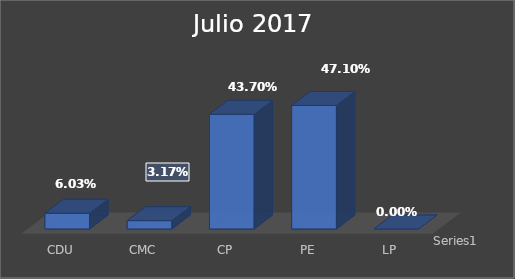
| Category | Series 0 |
|---|---|
| CDU | 0.06 |
| CMC | 0.032 |
| CP | 0.437 |
| PE | 0.471 |
| LP | 0 |